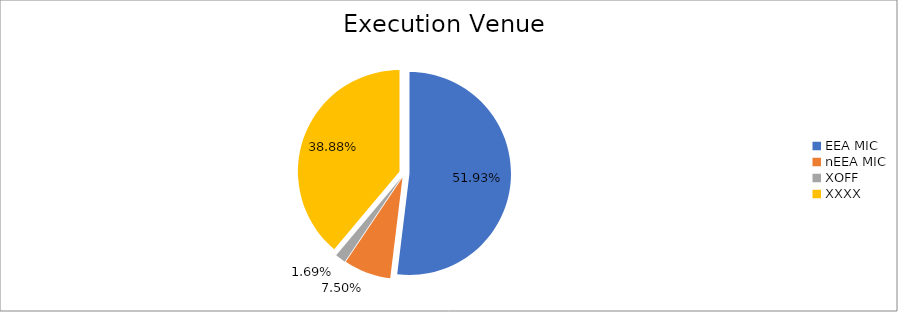
| Category | Series 0 |
|---|---|
| EEA MIC | 6729052.732 |
| nEEA MIC | 971544.049 |
| XOFF | 219441.121 |
| XXXX | 5037514.4 |